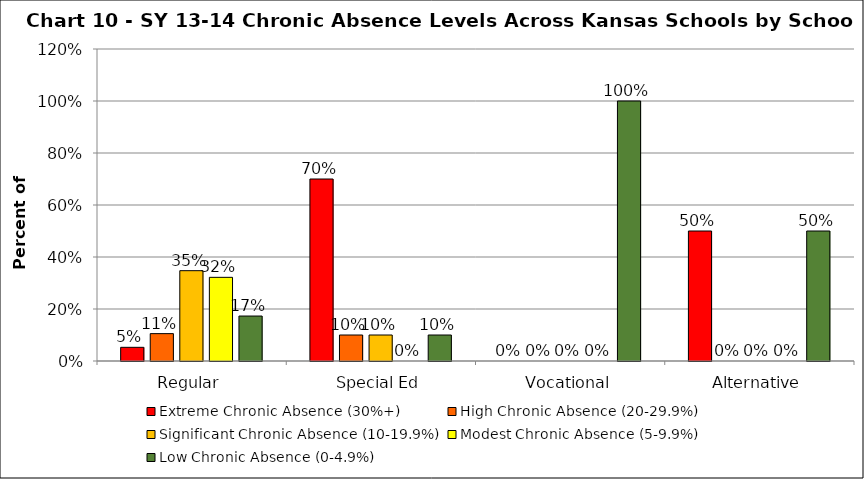
| Category | Extreme Chronic Absence (30%+) | High Chronic Absence (20-29.9%) | Significant Chronic Absence (10-19.9%) | Modest Chronic Absence (5-9.9%) | Low Chronic Absence (0-4.9%) |
|---|---|---|---|---|---|
| 0 | 0.053 | 0.105 | 0.347 | 0.322 | 0.173 |
| 1 | 0.7 | 0.1 | 0.1 | 0 | 0.1 |
| 2 | 0 | 0 | 0 | 0 | 1 |
| 3 | 0.5 | 0 | 0 | 0 | 0.5 |